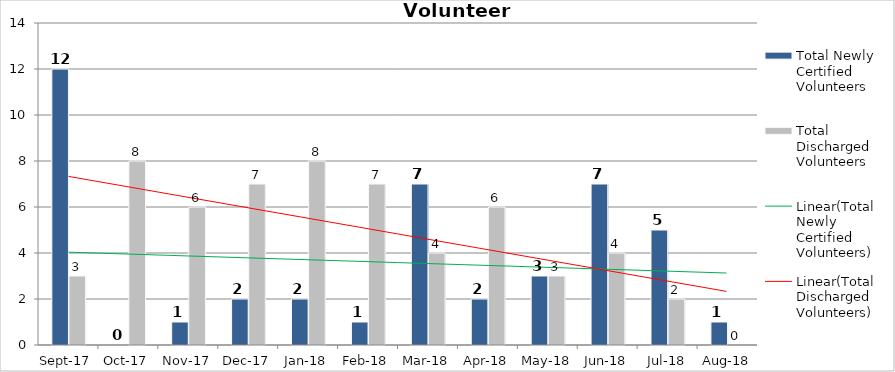
| Category | Total Newly Certified Volunteers | Total Discharged Volunteers |
|---|---|---|
| 2017-09-01 | 12 | 3 |
| 2017-10-01 | 0 | 8 |
| 2017-11-01 | 1 | 6 |
| 2017-12-01 | 2 | 7 |
| 2018-01-01 | 2 | 8 |
| 2018-02-01 | 1 | 7 |
| 2018-03-01 | 7 | 4 |
| 2018-04-01 | 2 | 6 |
| 2018-05-01 | 3 | 3 |
| 2018-06-01 | 7 | 4 |
| 2018-07-01 | 5 | 2 |
| 2018-08-01 | 1 | 0 |